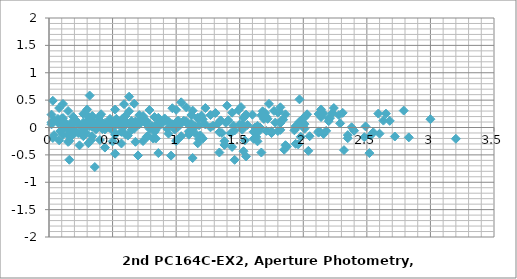
| Category | Series 0 |
|---|---|
| 1.9399999999999995 | -0.298 |
| 0.23000000000000043 | -0.102 |
| 0.1999999999999993 | -0.108 |
| 0.9700000000000006 | 0.054 |
| 0.370000000000001 | -0.031 |
| 0.17999999999999972 | -0.051 |
| 0.8499999999999996 | 0.011 |
| 1.9800000000000004 | -0.17 |
| 0.7099999999999991 | 0.057 |
| 2.3499999999999996 | -0.196 |
| 1.3100000000000005 | 0.265 |
| 0.14000000000000057 | -0.024 |
| 0.8100000000000005 | 0.01 |
| 1.1500000000000004 | 0.021 |
| 0.5399999999999991 | 0.101 |
| 1.83 | 0.132 |
| 0.6500000000000004 | -0.044 |
| 0.20999999999999908 | 0.134 |
| 0.11999999999999922 | 0.071 |
| 1.67 | -0.457 |
| 1.3499999999999996 | 0.127 |
| 0.02999999999999936 | -0.192 |
| 1.6400000000000006 | 0.031 |
| 0.3000000000000007 | 0.057 |
| 1.75 | -0.102 |
| 1.709999999999999 | 0.197 |
| 2.139999999999999 | 0.19 |
| 0.9699999999999989 | 0.352 |
| 2.3100000000000005 | 0.267 |
| 2.119999999999999 | 0.248 |
| 2.789999999999999 | 0.309 |
| 0.040000000000000924 | 0.128 |
| 1.2300000000000004 | 0.355 |
| 0.41000000000000014 | 0.103 |
| 0.629999999999999 | 0.563 |
| 1.799999999999999 | 0.274 |
| 1.129999999999999 | 0.309 |
| 0.7899999999999991 | 0.319 |
| 1.4000000000000004 | 0.399 |
| 0.10999999999999943 | 0.431 |
| 2.59 | 0.254 |
| 1.7300000000000004 | 0.432 |
| 1.8200000000000003 | 0.369 |
| 0.2699999999999996 | -0.159 |
| 0.5899999999999999 | 0.425 |
| 1.9699999999999989 | 0.107 |
| 0.29999999999999893 | 0.329 |
| 2.24 | 0.355 |
| 0.1899999999999995 | 0.197 |
| 0.4299999999999997 | -0.007 |
| 0.7400000000000002 | 0.156 |
| 0.6000000000000014 | 0.071 |
| 0.41000000000000014 | 0.051 |
| 1.08 | 0.112 |
| 1.75 | -0.068 |
| 0.47999999999999865 | 0.158 |
| 2.119999999999999 | -0.094 |
| 1.08 | 0.367 |
| 0.08999999999999986 | 0.078 |
| 0.5800000000000001 | 0.112 |
| 0.9199999999999999 | 0.123 |
| 0.3099999999999987 | 0.202 |
| 1.5999999999999996 | 0.234 |
| 0.8800000000000008 | 0.058 |
| 0.02000000000000135 | 0.236 |
| 0.11000000000000121 | 0.173 |
| 1.4399999999999995 | -0.355 |
| 1.1199999999999992 | 0.229 |
| 0.2599999999999998 | -0.09 |
| 1.4100000000000001 | 0.133 |
| 0.5300000000000011 | 0.159 |
| 1.5199999999999996 | 0 |
| 1.17 | 0.162 |
| 0.1700000000000017 | 0.077 |
| 0.019999999999999574 | 0.058 |
| 0.6500000000000004 | 0.119 |
| 2.1799999999999997 | -0.061 |
| 0.9099999999999984 | 0.165 |
| 2.549999999999999 | -0.087 |
| 1.5099999999999998 | 0.373 |
| 0.33999999999999986 | 0.084 |
| 1.0099999999999998 | 0.119 |
| 1.3499999999999996 | 0.129 |
| 0.7399999999999984 | 0.209 |
| 2.0299999999999994 | 0.241 |
| 0.45000000000000107 | 0.064 |
| 0.40999999999999837 | 0.242 |
| 0.3199999999999985 | 0.179 |
| 1.8699999999999992 | -0.349 |
| 1.549999999999999 | 0.235 |
| 0.16999999999999993 | -0.083 |
| 1.8399999999999999 | 0.139 |
| 0.10000000000000142 | 0.165 |
| 1.9499999999999993 | 0.007 |
| 1.3400000000000016 | -0.085 |
| 1.1500000000000004 | -0.105 |
| 1.8200000000000003 | -0.043 |
| 1.0099999999999998 | -0.224 |
| 0.26000000000000156 | 0.003 |
| 1.379999999999999 | -0.25 |
| 0.33999999999999986 | 0.211 |
| 0.8300000000000001 | -0.078 |
| 0.16000000000000014 | -0.044 |
| 0.17999999999999972 | -0.033 |
| 0.4300000000000015 | 0.046 |
| 0.8599999999999994 | 0.078 |
| 1.620000000000001 | -0.098 |
| 0.7600000000000016 | 0.08 |
| 0.8500000000000014 | 0.017 |
| 0.6999999999999993 | -0.511 |
| 0.379999999999999 | 0.073 |
| 1.0 | -0.246 |
| 0.6699999999999999 | -0.023 |
| 1.2700000000000014 | 0.003 |
| 0.7799999999999994 | -0.156 |
| 0.19000000000000128 | -0.019 |
| 0.47999999999999865 | 0.042 |
| 2.3500000000000014 | -0.139 |
| 1.08 | 0.088 |
| 2.7200000000000006 | -0.164 |
| 1.6800000000000015 | 0.296 |
| 0.5100000000000016 | 0.007 |
| 1.1800000000000015 | 0.041 |
| 1.5200000000000014 | 0.052 |
| 0.9100000000000001 | 0.132 |
| 2.200000000000001 | 0.163 |
| 0.27999999999999936 | -0.013 |
| 0.5800000000000001 | 0.165 |
| 0.4900000000000002 | 0.102 |
| 2.040000000000001 | -0.426 |
| 1.7200000000000006 | 0.158 |
| 0.34000000000000163 | -0.16 |
| 2.0100000000000016 | 0.062 |
| 0.07000000000000028 | 0.088 |
| 2.120000000000001 | -0.071 |
| 0.6699999999999999 | 0.061 |
| 2.16 | -0.119 |
| 0.8899999999999988 | 0.107 |
| 2.5299999999999994 | -0.145 |
| 1.4900000000000002 | 0.315 |
| 0.3200000000000003 | 0.026 |
| 0.9900000000000002 | 0.061 |
| 1.33 | 0.072 |
| 0.7199999999999989 | 0.151 |
| 2.01 | 0.183 |
| 0.47000000000000064 | 0.006 |
| 0.3899999999999988 | 0.184 |
| 0.29999999999999893 | 0.121 |
| 1.8499999999999996 | -0.407 |
| 1.5299999999999994 | 0.177 |
| 0.15000000000000036 | -0.141 |
| 1.8200000000000003 | 0.081 |
| 0.120000000000001 | 0.108 |
| 1.9299999999999997 | -0.051 |
| 2.83 | -0.181 |
| 1.5599999999999987 | 0.046 |
| 3.1999999999999993 | -0.206 |
| 2.16 | 0.254 |
| 0.9900000000000002 | -0.035 |
| 1.6600000000000001 | -0.001 |
| 2.0 | 0.01 |
| 1.3899999999999988 | 0.09 |
| 2.6799999999999997 | 0.122 |
| 0.1999999999999993 | -0.055 |
| 1.0599999999999987 | 0.123 |
| 0.9699999999999989 | 0.06 |
| 2.5199999999999996 | -0.468 |
| 2.1999999999999993 | 0.116 |
| 0.8200000000000003 | -0.202 |
| 2.49 | 0.02 |
| 0.5499999999999989 | 0.046 |
| 2.5999999999999996 | -0.112 |
| 1.2700000000000014 | 0.227 |
| 0.3699999999999992 | -0.026 |
| 0.6699999999999999 | 0.435 |
| 1.8399999999999999 | 0.146 |
| 1.17 | 0.18 |
| 0.8300000000000001 | 0.191 |
| 1.4400000000000013 | 0.27 |
| 0.15000000000000036 | 0.302 |
| 2.630000000000001 | 0.126 |
| 1.7700000000000014 | 0.304 |
| 1.8600000000000012 | 0.241 |
| 0.3100000000000005 | -0.287 |
| 0.6300000000000008 | 0.297 |
| 2.01 | -0.022 |
| 0.33999999999999986 | 0.201 |
| 2.280000000000001 | 0.227 |
| 0.23000000000000043 | 0.068 |
| 1.6400000000000006 | -0.252 |
| 0.6000000000000014 | 0.208 |
| 0.5699999999999985 | -0.081 |
| 0.10000000000000142 | -0.046 |
| 0.4400000000000013 | -0.036 |
| 0.16999999999999993 | 0.044 |
| 1.120000000000001 | 0.076 |
| 1.3599999999999994 | -0.101 |
| 0.5 | 0.077 |
| 0.5899999999999999 | 0.014 |
| 0.9600000000000009 | -0.514 |
| 0.6400000000000006 | 0.07 |
| 0.7399999999999984 | -0.248 |
| 0.9300000000000015 | -0.026 |
| 1.0099999999999998 | 0 |
| 1.040000000000001 | -0.158 |
| 1.0399999999999991 | 0.46 |
| 2.209999999999999 | 0.172 |
| 1.5399999999999991 | 0.206 |
| 1.1999999999999993 | 0.217 |
| 1.8100000000000005 | 0.296 |
| 0.5199999999999996 | 0.328 |
| 3.0 | 0.152 |
| 2.1400000000000006 | 0.329 |
| 2.2300000000000004 | 0.266 |
| 0.6799999999999997 | -0.261 |
| 1.0 | 0.322 |
| 2.379999999999999 | 0.004 |
| 0.7099999999999991 | 0.226 |
| 2.6500000000000004 | 0.253 |
| 0.5999999999999996 | 0.094 |
| 1.17 | -0.289 |
| 0.5 | -0.255 |
| 0.16000000000000014 | -0.244 |
| 0.7700000000000014 | -0.164 |
| 0.5199999999999996 | -0.133 |
| 1.9600000000000009 | -0.309 |
| 1.1000000000000014 | -0.131 |
| 1.1900000000000013 | -0.194 |
| 0.35999999999999943 | -0.722 |
| 0.03999999999999915 | -0.138 |
| 1.3399999999999999 | -0.456 |
| 0.33000000000000007 | -0.234 |
| 1.6100000000000012 | -0.208 |
| 0.4399999999999995 | -0.367 |
| 0.6699999999999999 | 0.034 |
| 1.0099999999999998 | 0.045 |
| 0.3999999999999986 | 0.125 |
| 1.6899999999999995 | 0.156 |
| 0.7900000000000009 | -0.02 |
| 0.06999999999999851 | 0.158 |
| 0.02000000000000135 | 0.095 |
| 1.5299999999999994 | -0.433 |
| 1.209999999999999 | 0.151 |
| 0.16999999999999993 | -0.168 |
| 1.5 | 0.055 |
| 0.4400000000000013 | 0.081 |
| 1.6099999999999994 | -0.078 |
| 0.33999999999999986 | 0.011 |
| 0.27000000000000135 | 0.09 |
| 1.0199999999999996 | 0.122 |
| 1.4600000000000009 | -0.054 |
| 0.6000000000000014 | 0.124 |
| 0.6900000000000013 | 0.061 |
| 0.8599999999999994 | -0.467 |
| 0.5399999999999991 | 0.117 |
| 0.8399999999999999 | -0.202 |
| 0.8300000000000001 | 0.021 |
| 1.1100000000000012 | 0.047 |
| 0.9399999999999995 | -0.112 |
| 0.6100000000000012 | 0.079 |
| 0.6799999999999997 | 0.111 |
| 1.8000000000000007 | -0.065 |
| 0.9400000000000013 | 0.113 |
| 1.0300000000000011 | 0.05 |
| 0.5199999999999996 | -0.478 |
| 0.1999999999999993 | 0.106 |
| 1.1799999999999997 | -0.213 |
| 0.4900000000000002 | 0.01 |
| 1.450000000000001 | 0.036 |
| 0.5999999999999996 | -0.123 |
| 1.290000000000001 | 0.032 |
| 1.1899999999999995 | -0.145 |
| 0.33000000000000007 | 0.033 |
| 0.41999999999999993 | -0.03 |
| 1.1300000000000008 | -0.558 |
| 0.8100000000000005 | 0.026 |
| 0.5699999999999985 | -0.292 |
| 1.1000000000000014 | -0.07 |
| 0.8399999999999999 | -0.043 |
| 1.2100000000000009 | -0.202 |
| 2.4800000000000004 | -0.176 |
| 1.620000000000001 | 0.001 |
| 1.7100000000000009 | -0.061 |
| 0.16000000000000014 | -0.589 |
| 0.4800000000000004 | -0.006 |
| 1.8599999999999994 | -0.324 |
| 0.1899999999999995 | -0.101 |
| 2.130000000000001 | -0.075 |
| 0.08000000000000007 | -0.234 |
| 0.8599999999999994 | 0.178 |
| 0.7699999999999996 | 0.115 |
| 2.3200000000000003 | -0.413 |
| 2.0 | 0.171 |
| 0.620000000000001 | -0.148 |
| 2.290000000000001 | 0.075 |
| 0.34999999999999964 | 0.101 |
| 2.4000000000000004 | -0.058 |
| 0.08999999999999986 | -0.063 |
| 1.4600000000000009 | -0.591 |
| 1.1400000000000006 | -0.007 |
| 0.23999999999999844 | -0.325 |
| 1.4300000000000015 | -0.103 |
| 0.5099999999999998 | -0.077 |
| 1.540000000000001 | -0.235 |
| 1.5500000000000007 | -0.528 |
| 1.2300000000000004 | 0.056 |
| 0.14999999999999858 | -0.262 |
| 1.5200000000000014 | -0.04 |
| 0.41999999999999993 | -0.014 |
| 1.6300000000000008 | -0.173 |
| 0.3200000000000003 | 0.584 |
| 1.6999999999999993 | 0.265 |
| 0.02999999999999936 | 0.488 |
| 1.9700000000000006 | 0.514 |
| 0.08000000000000007 | 0.355 |
| 1.379999999999999 | -0.318 |
| 0.2900000000000009 | -0.096 |
| 1.6500000000000004 | -0.07 |
| 0.40000000000000036 | -0.229 |
| 1.67 | 0.222 |
| 0.27000000000000135 | 0.249 |
| 1.7799999999999994 | 0.09 |
| 1.9400000000000013 | 0.026 |
| 0.10999999999999943 | -0.133 |
| 2.0500000000000007 | -0.159 |